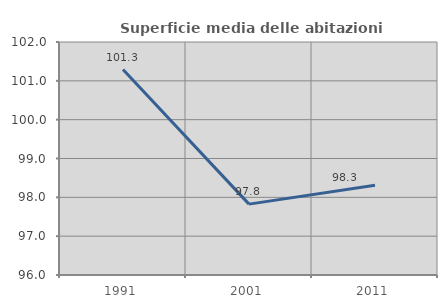
| Category | Superficie media delle abitazioni occupate |
|---|---|
| 1991.0 | 101.291 |
| 2001.0 | 97.825 |
| 2011.0 | 98.314 |